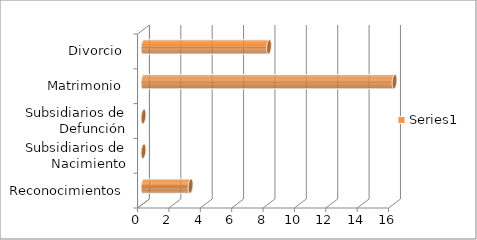
| Category | Series 0 |
|---|---|
| Reconocimientos | 3 |
| Subsidiarios de Nacimiento | 0 |
| Subsidiarios de Defunción | 0 |
| Matrimonio | 16 |
| Divorcio | 8 |